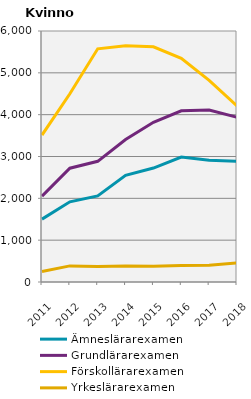
| Category | Ämneslärarexamen                                   | Grundlärarexamen                                   | Förskollärarexamen                                 | Yrkeslärarexamen                                   |
|---|---|---|---|---|
| 2011.0 | 1503 | 2054 | 3513 | 250 |
| 2012.0 | 1917 | 2720 | 4499 | 385 |
| 2013.0 | 2058 | 2885 | 5574 | 370 |
| 2014.0 | 2548 | 3407 | 5645 | 385 |
| 2015.0 | 2724 | 3818 | 5622 | 374 |
| 2016.0 | 2988 | 4093 | 5345 | 395 |
| 2017.0 | 2912 | 4110 | 4821 | 400 |
| 2018.0 | 2883 | 3938 | 4211 | 454 |